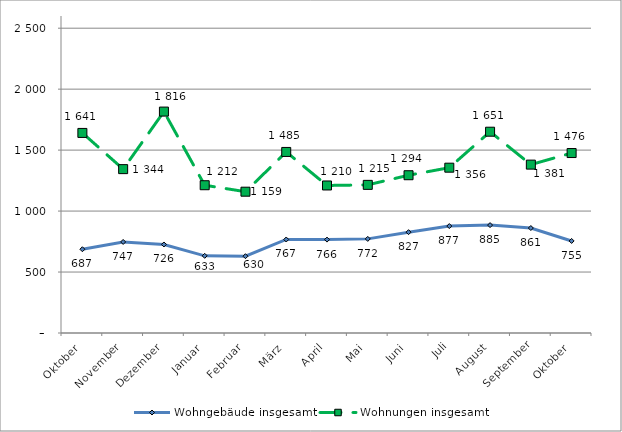
| Category | Wohngebäude insgesamt | Wohnungen insgesamt |
|---|---|---|
| Oktober | 687 | 1641 |
| November | 747 | 1344 |
| Dezember | 726 | 1816 |
| Januar | 633 | 1212 |
| Februar | 630 | 1159 |
| März | 767 | 1485 |
| April | 766 | 1210 |
| Mai | 772 | 1215 |
| Juni | 827 | 1294 |
| Juli | 877 | 1356 |
| August | 885 | 1651 |
| September | 861 | 1381 |
| Oktober | 755 | 1476 |